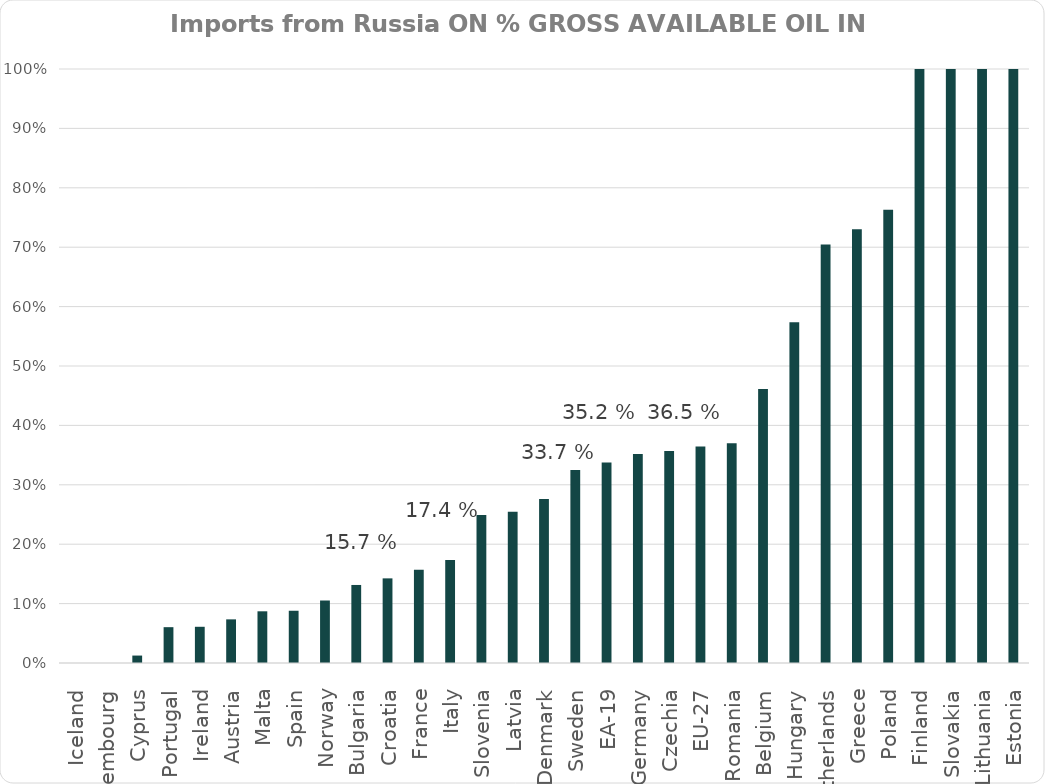
| Category | Oil |
|---|---|
| Iceland | 0 |
| Luxembourg | 0 |
| Cyprus | 0.013 |
| Portugal | 0.06 |
| Ireland | 0.061 |
| Austria | 0.073 |
| Malta | 0.087 |
| Spain | 0.088 |
| Norway | 0.105 |
| Bulgaria | 0.131 |
| Croatia | 0.142 |
| France | 0.157 |
| Italy | 0.174 |
| Slovenia | 0.249 |
| Latvia | 0.255 |
| Denmark | 0.276 |
| Sweden | 0.325 |
| EA-19 | 0.337 |
| Germany | 0.352 |
| Czechia | 0.357 |
| EU-27 | 0.365 |
| Romania | 0.37 |
| Belgium | 0.461 |
| Hungary | 0.574 |
| Netherlands | 0.705 |
| Greece | 0.73 |
| Poland | 0.763 |
| Finland | 1.412 |
| Slovakia | 1.594 |
| Lithuania | 2.027 |
| Estonia | 2.794 |